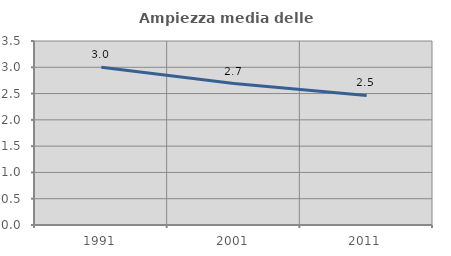
| Category | Ampiezza media delle famiglie |
|---|---|
| 1991.0 | 3.002 |
| 2001.0 | 2.691 |
| 2011.0 | 2.463 |